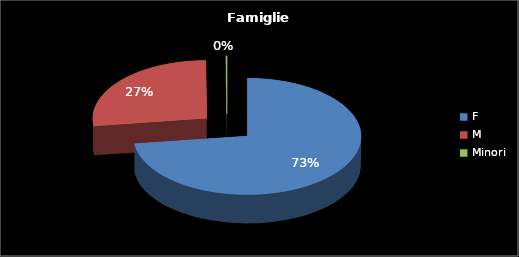
| Category | Series 0 |
|---|---|
| F | 506 |
| M | 187 |
| Minori | 1 |